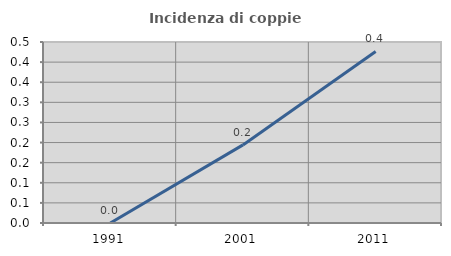
| Category | Incidenza di coppie miste |
|---|---|
| 1991.0 | 0 |
| 2001.0 | 0.194 |
| 2011.0 | 0.426 |